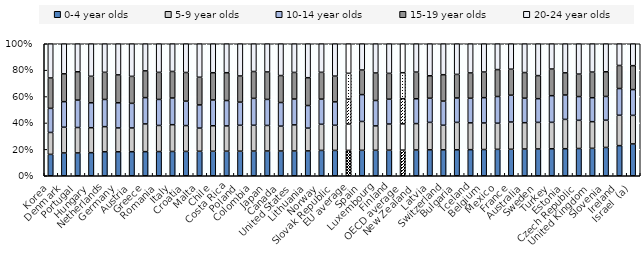
| Category | 0-4 year olds | 5-9 year olds | 10-14 year olds | 15-19 year olds | 20-24 year olds |
|---|---|---|---|---|---|
| Korea | 16.202 | 16.6 | 18.255 | 23.013 | 25.93 |
| Denmark | 17.284 | 19.505 | 19.336 | 21.106 | 22.77 |
| Portugal | 17.287 | 19.263 | 20.757 | 21.457 | 21.236 |
| Hungary | 17.489 | 18.9 | 18.901 | 20.073 | 24.636 |
| Netherlands | 18.137 | 19.061 | 20.594 | 20.561 | 21.647 |
| Germany | 18.14 | 18.089 | 19.046 | 21.152 | 23.572 |
| Austria | 18.22 | 17.997 | 18.64 | 20.45 | 24.694 |
| Greece | 18.265 | 21.002 | 19.921 | 20.273 | 20.539 |
| Romania | 18.325 | 19.785 | 19.706 | 20.521 | 21.664 |
| Italy | 18.418 | 20.269 | 20.223 | 20.112 | 20.978 |
| Croatia | 18.443 | 19.57 | 18.503 | 21.724 | 21.759 |
| Malta | 18.556 | 17.54 | 17.57 | 20.958 | 25.376 |
| Chile | 18.568 | 19.301 | 19.551 | 20.643 | 21.936 |
| Costa Rica | 18.61 | 19.15 | 19.217 | 21.099 | 21.925 |
| Poland | 18.63 | 19.608 | 17.529 | 19.817 | 24.415 |
| Colombia | 18.709 | 19.545 | 20.367 | 20.368 | 21.011 |
| Japan | 18.771 | 19.343 | 19.726 | 20.803 | 21.357 |
| Canada | 18.771 | 18.82 | 17.883 | 20.442 | 24.084 |
| United States | 18.777 | 19.773 | 19.593 | 20.145 | 21.711 |
| Lithuania | 18.829 | 17.259 | 17.118 | 21.083 | 25.711 |
| Norway | 19.203 | 19.789 | 19.063 | 20.303 | 21.642 |
| Slovak Republic | 19.208 | 19.043 | 17.717 | 19.522 | 24.511 |
| EU average | 19.221 | 19.883 | 18.928 | 19.583 | 22.384 |
| Spain | 19.282 | 21.841 | 20.353 | 18.629 | 19.896 |
| Luxembourg | 19.293 | 18.487 | 19.229 | 20.843 | 22.147 |
| Finland | 19.384 | 19.807 | 18.833 | 19.556 | 22.42 |
| OECD average | 19.406 | 19.882 | 19.086 | 19.699 | 21.927 |
| New Zealand | 19.539 | 19.979 | 18.815 | 20.187 | 21.481 |
| Latvia | 19.64 | 20.805 | 18.294 | 16.999 | 24.262 |
| Switzerland | 19.642 | 18.623 | 18.281 | 20.007 | 23.447 |
| Bulgaria | 19.667 | 20.767 | 18.486 | 17.869 | 23.21 |
| Iceland | 19.776 | 20.298 | 18.647 | 19.169 | 22.11 |
| Belgium | 19.877 | 20.111 | 19.168 | 19.435 | 21.409 |
| Mexico | 20.017 | 19.784 | 20.226 | 20.415 | 19.559 |
| France | 20.084 | 20.625 | 20.335 | 19.707 | 19.249 |
| Australia | 20.259 | 19.945 | 18.573 | 19.41 | 21.813 |
| Sweden | 20.309 | 20.117 | 17.963 | 17.481 | 24.13 |
| Turkey | 20.419 | 20.051 | 20.192 | 20.207 | 19.131 |
| Estonia | 20.497 | 22.203 | 18.482 | 16.785 | 22.034 |
| Czech Republic | 20.653 | 21.357 | 17.98 | 17.032 | 22.979 |
| United Kingdom | 20.782 | 20.19 | 18.141 | 19.429 | 21.459 |
| Slovenia | 21.452 | 20.643 | 17.983 | 18.695 | 21.228 |
| Ireland | 22.826 | 23.007 | 20.248 | 17.472 | 16.448 |
| Israel  (a) | 24.116 | 21.632 | 19.526 | 18.139 | 16.586 |